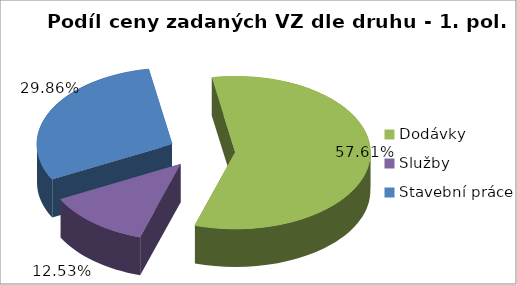
| Category | Series 0 |
|---|---|
| Dodávky | 113931.366 |
| Služby | 24789.255 |
| Stavební práce | 59050.146 |